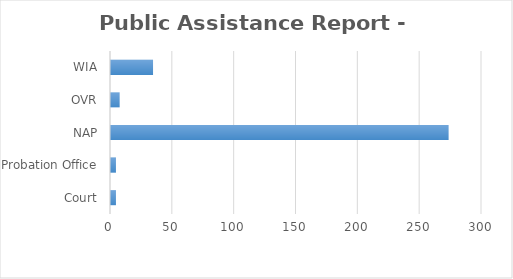
| Category | Series 0 |
|---|---|
| Court | 4 |
| Probation Office | 4 |
| NAP | 273 |
| OVR | 7 |
| WIA | 34 |